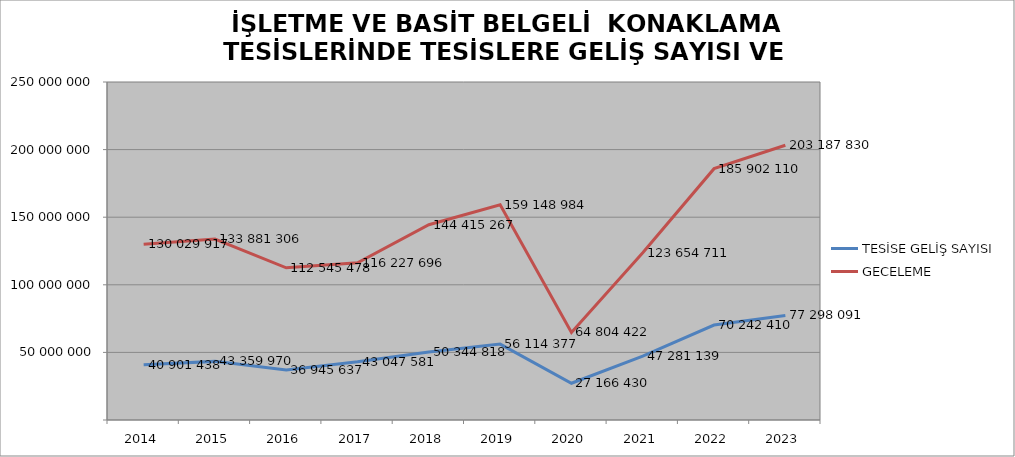
| Category | TESİSE GELİŞ SAYISI | GECELEME |
|---|---|---|
| 2014 | 40901438 | 130029917 |
| 2015 | 43359970 | 133881306 |
| 2016 | 36945637 | 112545478 |
| 2017 | 43047581 | 116227696 |
| 2018 | 50344818 | 144415267 |
| 2019 | 56114377 | 159148984 |
| 2020 | 27166430 | 64804422 |
| 2021 | 47281139 | 123654711 |
| 2022 | 70242410 | 185902110 |
| 2023 | 77298091 | 203187830 |